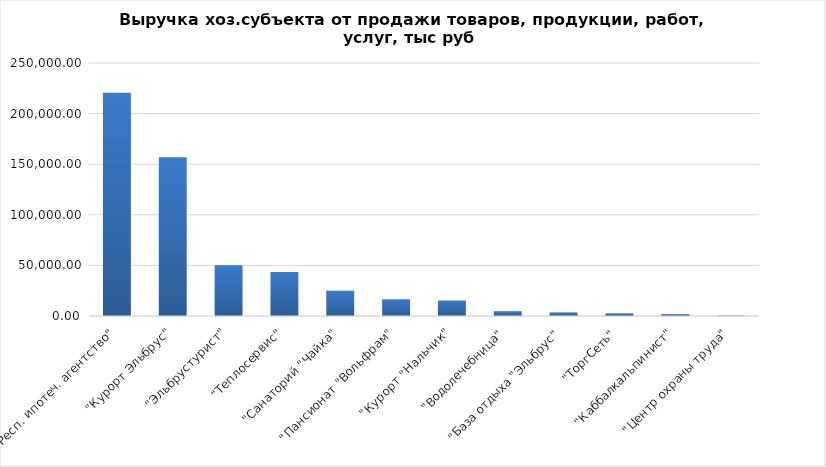
| Category | Выручка хоз.субъекта от продажи товаров, продукции, работ, услуг, тыс руб 
 |
|---|---|
|  "Респ. ипотеч. агентство" | 220510 |
| "Курорт Эльбрус" | 156964 |
| "Эльбрустурист" | 50111 |
| "Теплосервис" | 43502 |
| "Санаторий "Чайка" | 24968 |
| "Пансионат "Вольфрам" | 16545 |
| "Курорт "Нальчик" | 15251 |
| "Водолечебница" | 4756 |
| "База отдыха "Эльбрус" | 3574 |
| "ТоргСеть" | 2680.3 |
| "Каббалкальпинист" | 1859 |
| "Центр охраны труда" | 390 |